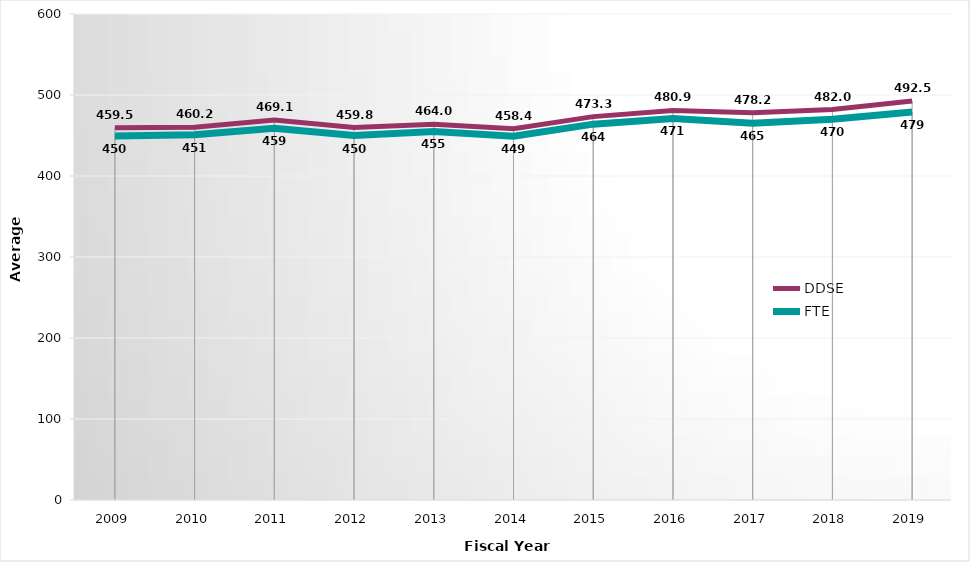
| Category | DDSE | FTE |
|---|---|---|
| 2009.0 | 459.5 | 449.5 |
| 2010.0 | 460.2 | 451 |
| 2011.0 | 469.1 | 459 |
| 2012.0 | 459.8 | 450 |
| 2013.0 | 464 | 455 |
| 2014.0 | 458.4 | 449 |
| 2015.0 | 473.3 | 464 |
| 2016.0 | 480.9 | 471 |
| 2017.0 | 478.2 | 465 |
| 2018.0 | 482 | 470 |
| 2019.0 | 492.5 | 479 |